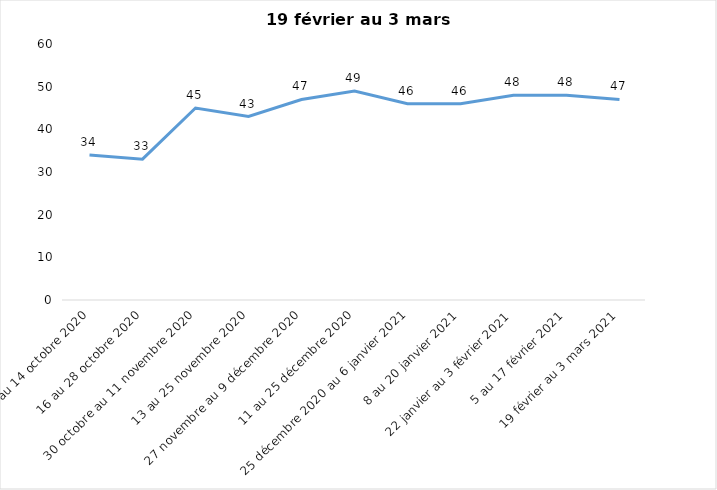
| Category | Toujours aux trois mesures |
|---|---|
| 2 au 14 octobre 2020 | 34 |
| 16 au 28 octobre 2020 | 33 |
| 30 octobre au 11 novembre 2020 | 45 |
| 13 au 25 novembre 2020 | 43 |
| 27 novembre au 9 décembre 2020 | 47 |
| 11 au 25 décembre 2020 | 49 |
| 25 décembre 2020 au 6 janvier 2021 | 46 |
| 8 au 20 janvier 2021 | 46 |
| 22 janvier au 3 février 2021 | 48 |
| 5 au 17 février 2021 | 48 |
| 19 février au 3 mars 2021 | 47 |